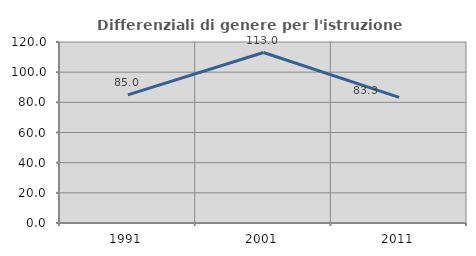
| Category | Differenziali di genere per l'istruzione superiore |
|---|---|
| 1991.0 | 84.965 |
| 2001.0 | 113.018 |
| 2011.0 | 83.254 |